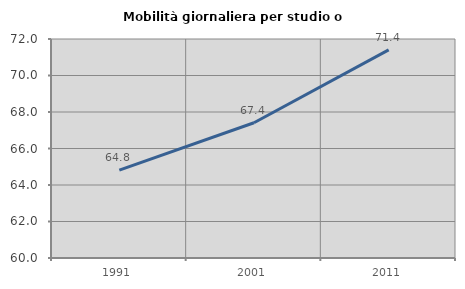
| Category | Mobilità giornaliera per studio o lavoro |
|---|---|
| 1991.0 | 64.811 |
| 2001.0 | 67.41 |
| 2011.0 | 71.405 |